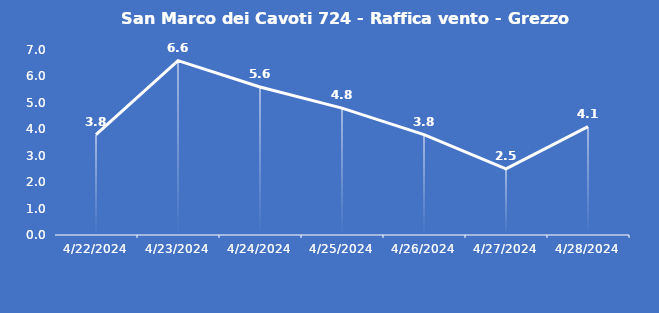
| Category | San Marco dei Cavoti 724 - Raffica vento - Grezzo (m/s) |
|---|---|
| 4/22/24 | 3.8 |
| 4/23/24 | 6.6 |
| 4/24/24 | 5.6 |
| 4/25/24 | 4.8 |
| 4/26/24 | 3.8 |
| 4/27/24 | 2.5 |
| 4/28/24 | 4.1 |